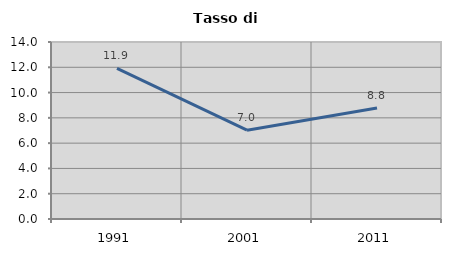
| Category | Tasso di disoccupazione   |
|---|---|
| 1991.0 | 11.91 |
| 2001.0 | 7.023 |
| 2011.0 | 8.777 |